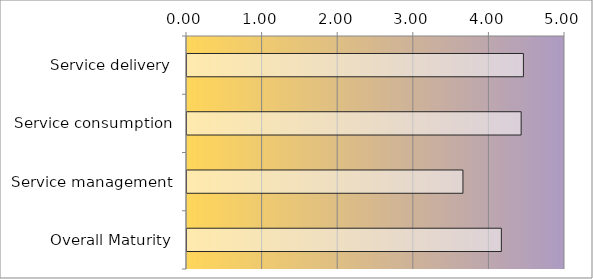
| Category | Series 0 |
|---|---|
| Service delivery | 4.45 |
| Service consumption | 4.42 |
| Service management | 3.65 |
| Overall Maturity | 4.158 |